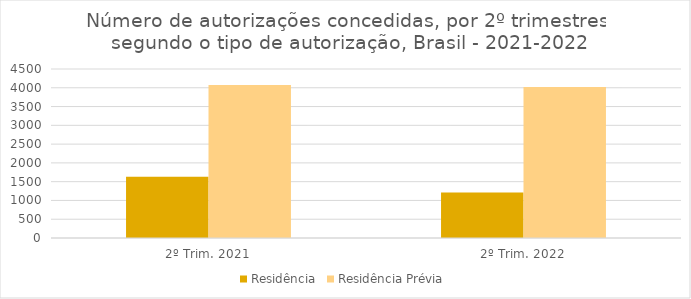
| Category | Residência | Residência Prévia |
|---|---|---|
| 2º Trim. 2021 | 1634 | 4076 |
| 2º Trim. 2022 | 1213 | 4019 |